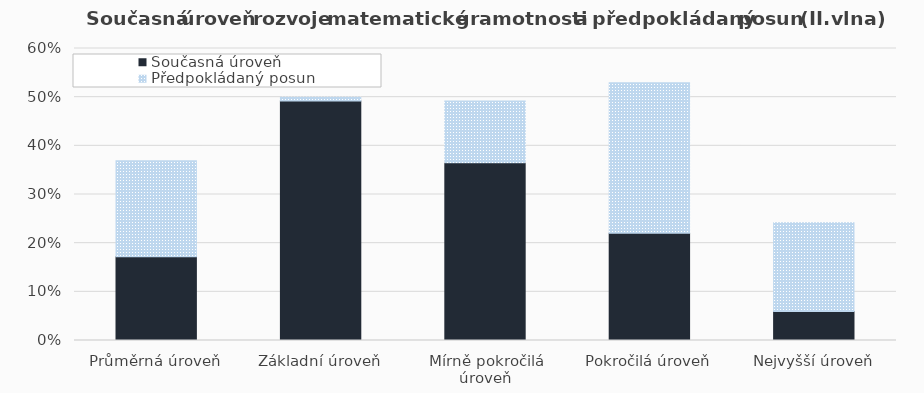
| Category | Současná úroveň | Předpokládaný posun |
|---|---|---|
| Průměrná úroveň | 0.172 | 0.197 |
| Základní úroveň | 0.492 | 0.008 |
| Mírně pokročilá úroveň | 0.365 | 0.127 |
| Pokročilá úroveň | 0.22 | 0.31 |
| Nejvyšší úroveň | 0.06 | 0.183 |